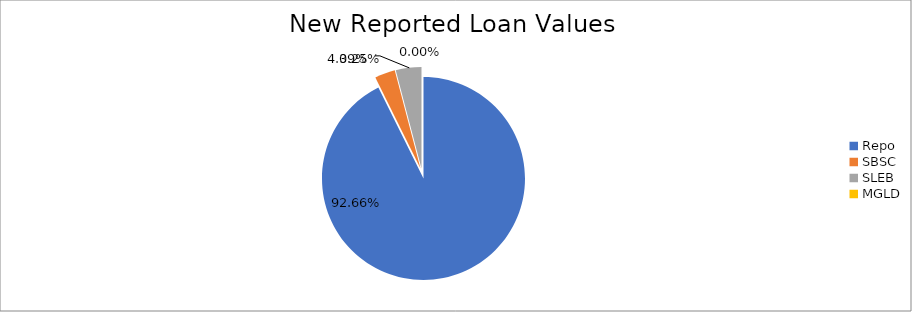
| Category | Series 0 |
|---|---|
| Repo | 9187141.284 |
| SBSC | 322273.755 |
| SLEB | 405033.545 |
| MGLD | 16.287 |